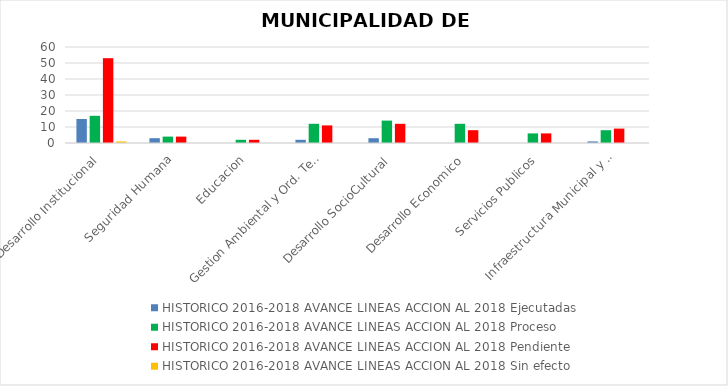
| Category | HISTORICO 2016-2018 |
|---|---|
| Desarrollo Institucional | 1 |
| Seguridad Humana | 0 |
| Educacion | 0 |
| Gestion Ambiental y Ord. Territorial | 0 |
| Desarrollo SocioCultural | 0 |
| Desarrollo Economico | 0 |
| Servicios Publicos | 0 |
| Infraestructura Municipal y Vial | 0 |